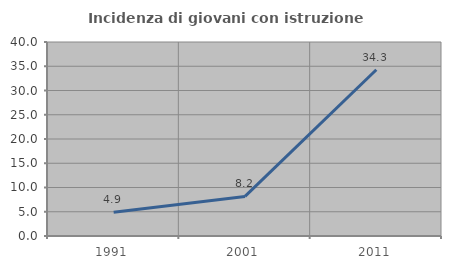
| Category | Incidenza di giovani con istruzione universitaria |
|---|---|
| 1991.0 | 4.878 |
| 2001.0 | 8.163 |
| 2011.0 | 34.286 |